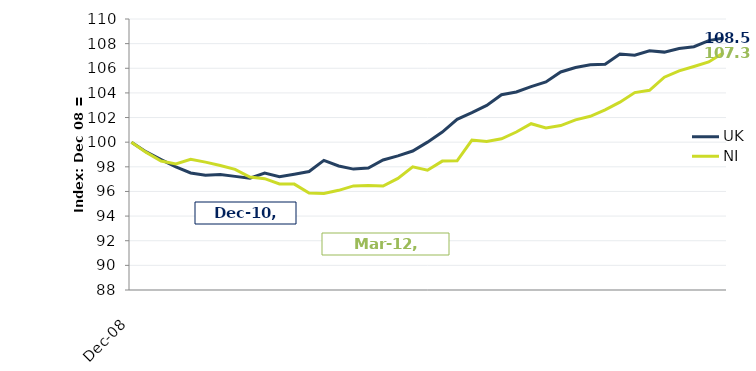
| Category | UK |
|---|---|
| 39783.0 | 100 |
| 39873.0 | 99.207 |
| 39965.0 | 98.582 |
| 40057.0 | 97.988 |
| 40148.0 | 97.501 |
| 40238.0 | 97.309 |
| 40330.0 | 97.377 |
| 40422.0 | 97.224 |
| 40513.0 | 97.071 |
| 40603.0 | 97.49 |
| 40695.0 | 97.199 |
| 40787.0 | 97.401 |
| 40878.0 | 97.622 |
| 40969.0 | 98.525 |
| 41061.0 | 98.07 |
| 41153.0 | 97.814 |
| 41244.0 | 97.899 |
| 41334.0 | 98.557 |
| 41426.0 | 98.891 |
| 41518.0 | 99.282 |
| 41609.0 | 100.004 |
| 41699.0 | 100.821 |
| 41791.0 | 101.859 |
| 41883.0 | 102.396 |
| 41974.0 | 102.982 |
| 42064.0 | 103.857 |
| 42156.0 | 104.077 |
| 42248.0 | 104.511 |
| 42339.0 | 104.888 |
| 42430.0 | 105.702 |
| 42522.0 | 106.064 |
| 42614.0 | 106.285 |
| 42705.0 | 106.32 |
| 42795.0 | 107.156 |
| 42887.0 | 107.053 |
| 42979.0 | 107.422 |
| 43070.0 | 107.312 |
| 43160.0 | 107.607 |
| 43252.0 | 107.749 |
| 43344.0 | 108.247 |
| 43435.0 | 108.457 |